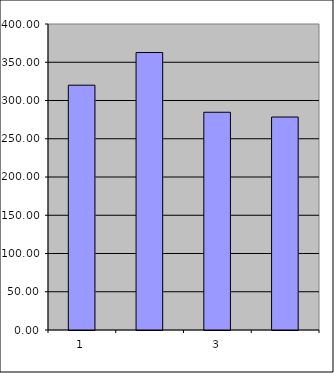
| Category | Series 0 |
|---|---|
| 0 | 320 |
| 1 | 362.706 |
| 2 | 284.633 |
| 3 | 278.407 |